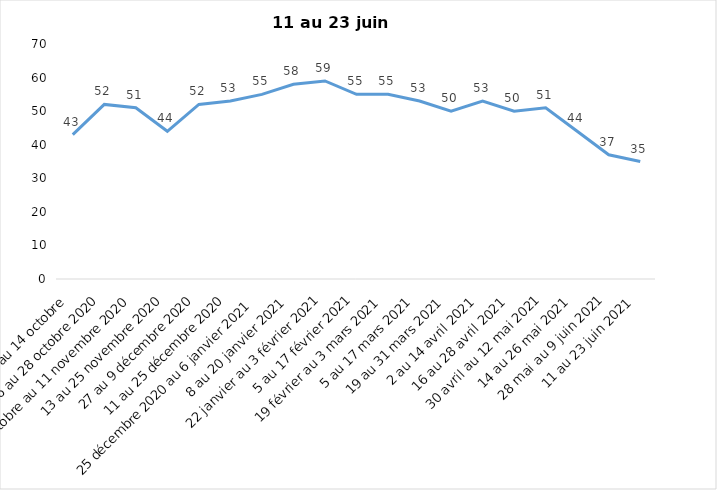
| Category | Toujours aux trois mesures |
|---|---|
| 2 au 14 octobre  | 43 |
| 16 au 28 octobre 2020 | 52 |
| 30 octobre au 11 novembre 2020 | 51 |
| 13 au 25 novembre 2020 | 44 |
| 27 au 9 décembre 2020 | 52 |
| 11 au 25 décembre 2020 | 53 |
| 25 décembre 2020 au 6 janvier 2021 | 55 |
| 8 au 20 janvier 2021 | 58 |
| 22 janvier au 3 février 2021 | 59 |
| 5 au 17 février 2021 | 55 |
| 19 février au 3 mars 2021 | 55 |
| 5 au 17 mars 2021 | 53 |
| 19 au 31 mars 2021 | 50 |
| 2 au 14 avril 2021 | 53 |
| 16 au 28 avril 2021 | 50 |
| 30 avril au 12 mai 2021 | 51 |
| 14 au 26 mai 2021 | 44 |
| 28 mai au 9 juin 2021 | 37 |
| 11 au 23 juin 2021 | 35 |